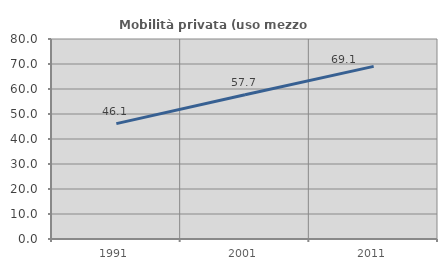
| Category | Mobilità privata (uso mezzo privato) |
|---|---|
| 1991.0 | 46.143 |
| 2001.0 | 57.73 |
| 2011.0 | 69.06 |